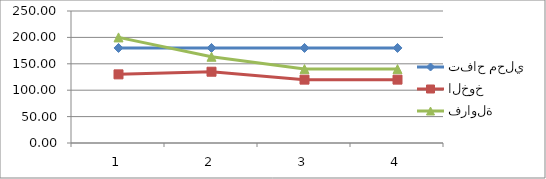
| Category | تفاح محلي | الخوخ | فراولة |
|---|---|---|---|
| 0 | 180 | 130 | 200 |
| 1 | 180 | 135 | 163.33 |
| 2 | 180 | 120 | 140 |
| 3 | 180 | 120 | 140 |